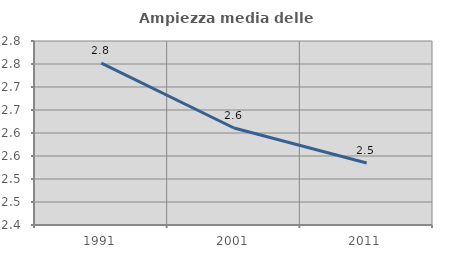
| Category | Ampiezza media delle famiglie |
|---|---|
| 1991.0 | 2.752 |
| 2001.0 | 2.611 |
| 2011.0 | 2.535 |